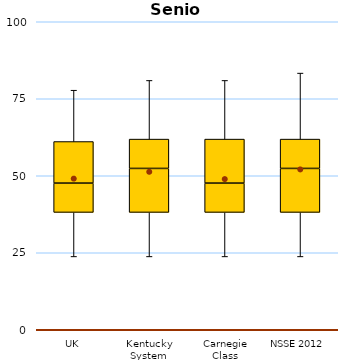
| Category | 25th | 50th | 75th |
|---|---|---|---|
| UK | 38.095 | 9.524 | 13.492 |
| Kentucky System | 38.095 | 14.286 | 9.524 |
| Carnegie Class | 38.095 | 9.524 | 14.286 |
| NSSE 2012 | 38.095 | 14.286 | 9.524 |